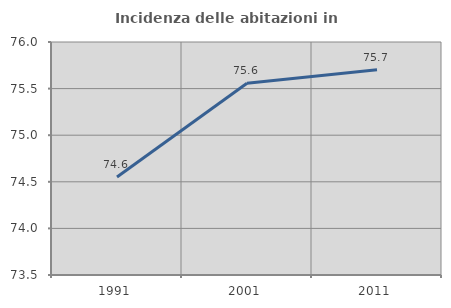
| Category | Incidenza delle abitazioni in proprietà  |
|---|---|
| 1991.0 | 74.552 |
| 2001.0 | 75.558 |
| 2011.0 | 75.701 |